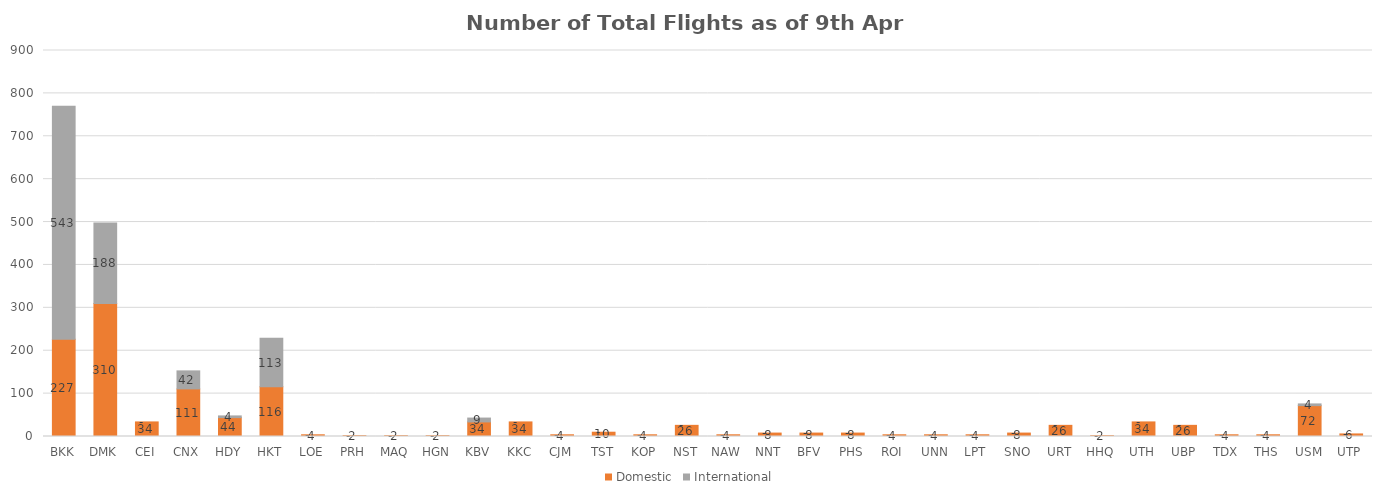
| Category | Domestic | International |
|---|---|---|
| BKK | 227 | 543 |
| DMK | 310 | 188 |
| CEI | 34 | 0 |
| CNX | 111 | 42 |
| HDY | 44 | 4 |
| HKT | 116 | 113 |
| LOE | 4 | 0 |
| PRH | 2 | 0 |
| MAQ | 2 | 0 |
| HGN | 2 | 0 |
| KBV | 34 | 9 |
| KKC | 34 | 0 |
| CJM | 4 | 0 |
| TST | 10 | 0 |
| KOP | 4 | 0 |
| NST | 26 | 0 |
| NAW | 4 | 0 |
| NNT | 8 | 0 |
| BFV | 8 | 0 |
| PHS | 8 | 0 |
| ROI | 4 | 0 |
| UNN | 4 | 0 |
| LPT | 4 | 0 |
| SNO | 8 | 0 |
| URT | 26 | 0 |
| HHQ | 2 | 0 |
| UTH | 34 | 0 |
| UBP | 26 | 0 |
| TDX | 4 | 0 |
| THS | 4 | 0 |
| USM | 72 | 4 |
| UTP | 6 | 0 |